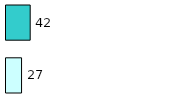
| Category | Series 0 | Series 1 |
|---|---|---|
| 0 | 27 | 42 |